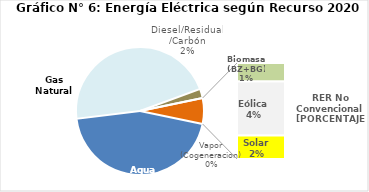
| Category | Series 0 |
|---|---|
| Agua | 2133.661 |
| Gas Natural | 2206.587 |
| Diesel/Residual/Carbón | 110.879 |
| Vapor (Cogeneracion) | 0.241 |
| Biomasa (BZ+BG) | 59.954 |
| Eólica | 174.101 |
| Solar | 76.363 |